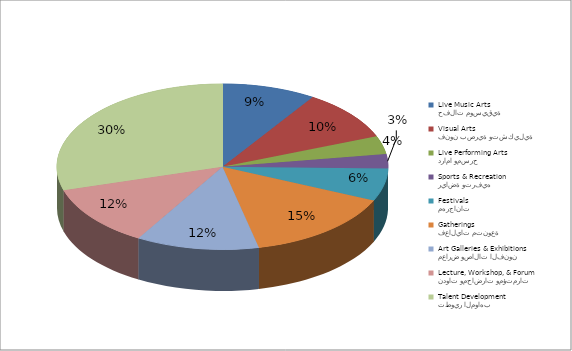
| Category | Series 0 |
|---|---|
| حفلات موسيقية
Live Music Arts | 13 |
| فنون بصرية وتشكيلية
Visual Arts | 14 |
| دراما ومسرح 
Live Performing Arts | 5 |
| رياضة وترفيه
Sports & Recreation | 4 |
| مهرجانات
Festivals | 9 |
| فعاليات متنوعة
Gatherings  | 21 |
| معارض وصالات الفنون 
Art Galleries & Exhibitions | 17 |
| ندوات ومحاضرات ومؤتمرات
Lecture, Workshop, & Forum | 17 |
| تطوير المواهب
Talent Development | 42 |